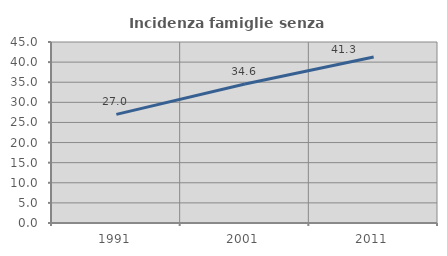
| Category | Incidenza famiglie senza nuclei |
|---|---|
| 1991.0 | 27.007 |
| 2001.0 | 34.563 |
| 2011.0 | 41.274 |